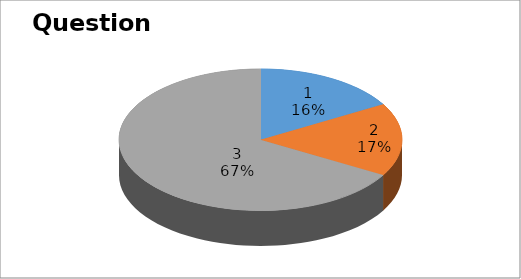
| Category | Series 0 |
|---|---|
| 0 | 1 |
| 1 | 1 |
| 2 | 4 |